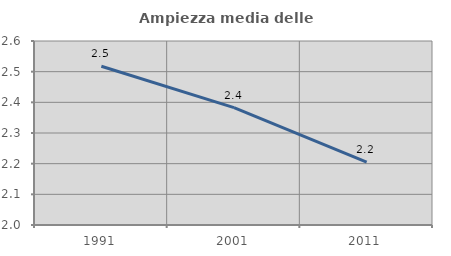
| Category | Ampiezza media delle famiglie |
|---|---|
| 1991.0 | 2.518 |
| 2001.0 | 2.383 |
| 2011.0 | 2.205 |